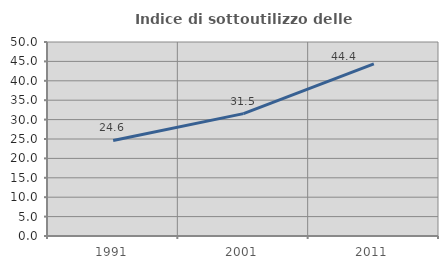
| Category | Indice di sottoutilizzo delle abitazioni  |
|---|---|
| 1991.0 | 24.62 |
| 2001.0 | 31.546 |
| 2011.0 | 44.35 |